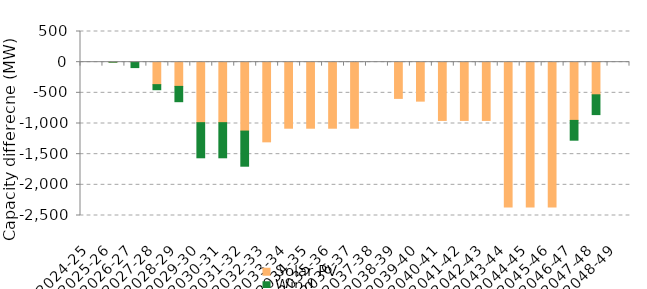
| Category | Solar PV | Wind | Offshore wind |
|---|---|---|---|
| 2024-25 | 0 | 0 | 0 |
| 2025-26 | 0 | 0 | 0 |
| 2026-27 | 0 | -88.541 | 0 |
| 2027-28 | -366.407 | -82.564 | 0 |
| 2028-29 | -395.01 | -249.404 | 0 |
| 2029-30 | -986.217 | -572.848 | 0 |
| 2030-31 | -986.217 | -572.848 | 0 |
| 2031-32 | -1123.467 | -572.848 | 0 |
| 2032-33 | -1299.016 | 0 | 0 |
| 2033-34 | -1076.789 | 0 | 0 |
| 2034-35 | -1076.789 | 0 | 0 |
| 2035-36 | -1076.789 | 0 | 0 |
| 2036-37 | -1076.789 | 0 | 0 |
| 2037-38 | 0 | 0 | 0 |
| 2038-39 | -590.706 | 0 | 0 |
| 2039-40 | -635.382 | 0 | 0 |
| 2040-41 | -950.14 | 0 | 0 |
| 2041-42 | -950.14 | 0 | 0 |
| 2042-43 | -950.14 | 0 | 0 |
| 2043-44 | -2362.318 | 0 | 0 |
| 2044-45 | -2362.318 | 0 | 0 |
| 2045-46 | -2362.318 | 0 | 0 |
| 2046-47 | -949.394 | -322.889 | 0 |
| 2047-48 | -531.98 | -322.889 | 0 |
| 2048-49 | 0 | 0 | 0 |